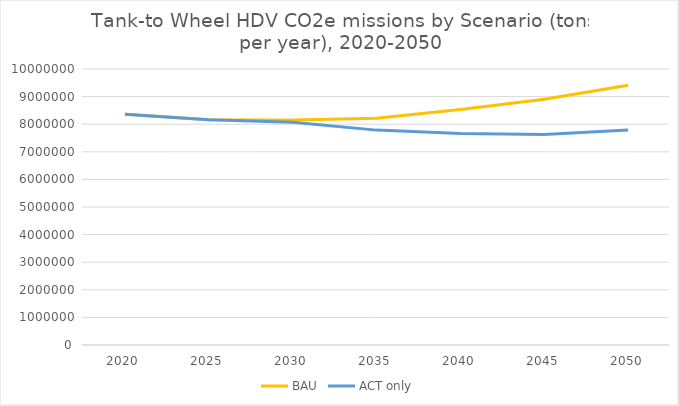
| Category | BAU | ACT only |
|---|---|---|
| 2020.0 | 8356302.968 | 8356302.968 |
| 2025.0 | 8162099.164 | 8162099.164 |
| 2030.0 | 8152464.33 | 8072183.606 |
| 2035.0 | 8219669.119 | 7785456.083 |
| 2040.0 | 8534981.592 | 7660748.387 |
| 2045.0 | 8900791.068 | 7622913.571 |
| 2050.0 | 9411328.364 | 7787205.023 |